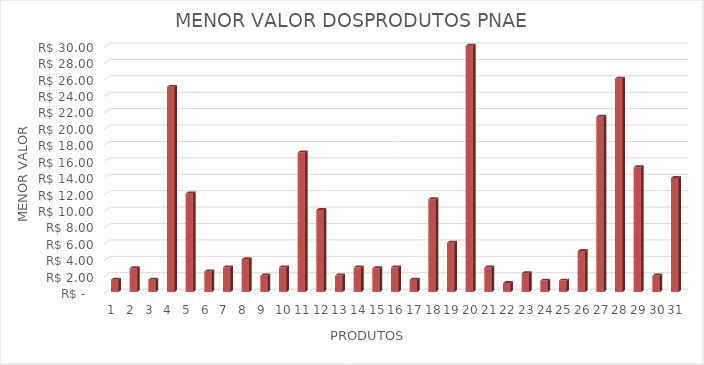
| Category | Series 0 |
|---|---|
| 0 | 1.5 |
| 1 | 2.89 |
| 2 | 1.5 |
| 3 | 25 |
| 4 | 12 |
| 5 | 2.5 |
| 6 | 3 |
| 7 | 4 |
| 8 | 2 |
| 9 | 3 |
| 10 | 16.99 |
| 11 | 10 |
| 12 | 2 |
| 13 | 3 |
| 14 | 2.89 |
| 15 | 3 |
| 16 | 1.5 |
| 17 | 11.3 |
| 18 | 6 |
| 19 | 35.7 |
| 20 | 3 |
| 21 | 1.09 |
| 22 | 2.29 |
| 23 | 1.39 |
| 24 | 1.39 |
| 25 | 5 |
| 26 | 21.35 |
| 27 | 26 |
| 28 | 15.2 |
| 29 | 2 |
| 30 | 13.9 |